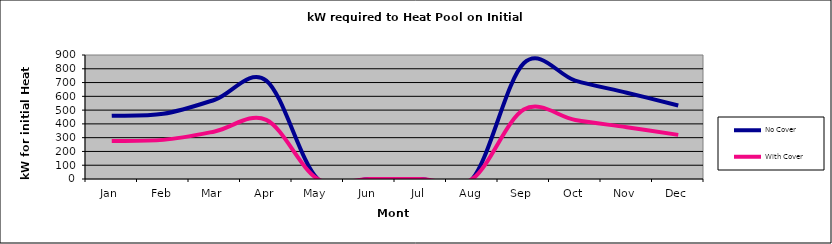
| Category | No Cover | With Cover |
|---|---|---|
| Jan | 459.36 | 275.616 |
| Feb | 473.28 | 283.968 |
| Mar | 575.36 | 345.216 |
| Apr | 714.56 | 428.736 |
| May | 0 | 0 |
| Jun | 0 | 0 |
| Jul | 0 | 0 |
| Aug | 0 | 0 |
| Sep | 839.84 | 503.904 |
| Oct | 714.56 | 428.736 |
| Nov | 626.4 | 375.84 |
| Dec | 533.6 | 320.16 |